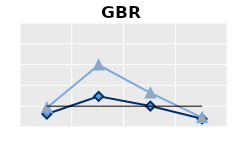
| Category | Public goods | Individual items only | Series 1 |
|---|---|---|---|
| 15-24 | 0.622 | 0.924 | 1 |
| 25-54 | 1.475 | 2.98 | 1 |
| 55-64 | 1.006 | 1.64 | 1 |
| 65+ | 0.392 | 0.452 | 1 |